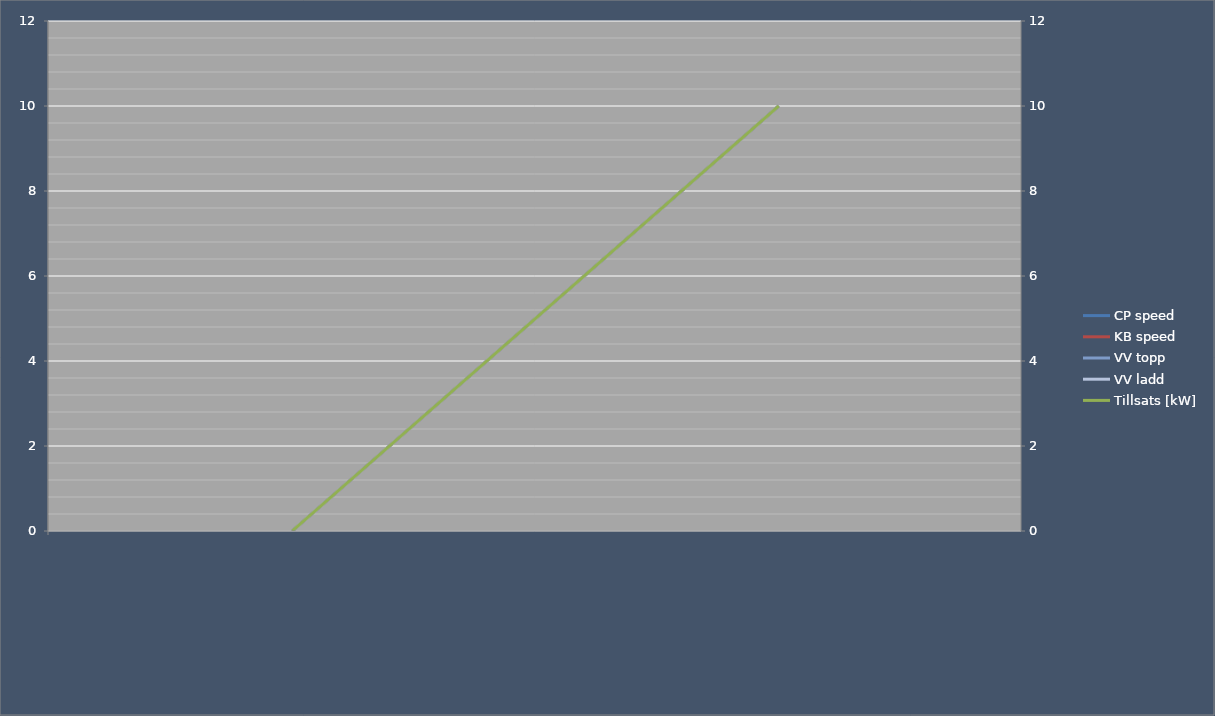
| Category | CP speed | KB speed | VV topp | VV ladd |
|---|---|---|---|---|
|  | 0 | 0 | 0 | 0 |
|  | 10 | 10 | 10 | 10 |